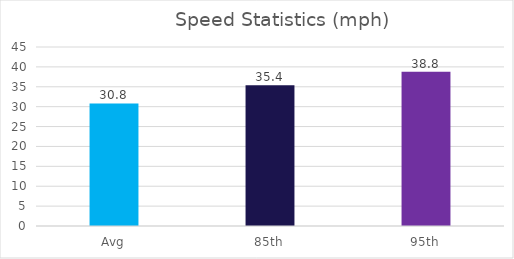
| Category | Series 0 |
|---|---|
| Avg | 30.8 |
| 85th | 35.4 |
| 95th | 38.8 |